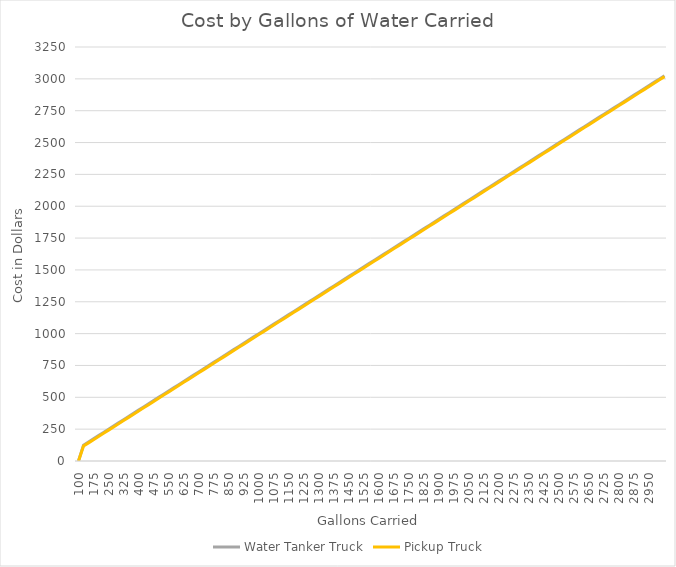
| Category | Water Tanker Truck | Pickup Truck |
|---|---|---|
| 100.0 | 0 | 0 |
| 125.0 | 124.402 | 117.357 |
| 150.0 | 149.402 | 142.357 |
| 175.0 | 174.402 | 167.357 |
| 200.0 | 199.402 | 192.357 |
| 225.0 | 224.402 | 217.357 |
| 250.0 | 249.402 | 242.357 |
| 275.0 | 274.402 | 267.357 |
| 300.0 | 299.402 | 292.357 |
| 325.0 | 324.402 | 317.357 |
| 350.0 | 349.402 | 342.357 |
| 375.0 | 374.402 | 367.357 |
| 400.0 | 399.402 | 392.357 |
| 425.0 | 424.402 | 417.357 |
| 450.0 | 449.402 | 442.357 |
| 475.0 | 474.402 | 467.357 |
| 500.0 | 499.402 | 492.357 |
| 525.0 | 524.402 | 517.357 |
| 550.0 | 549.402 | 542.357 |
| 575.0 | 574.402 | 567.357 |
| 600.0 | 599.402 | 592.357 |
| 625.0 | 624.402 | 617.357 |
| 650.0 | 649.402 | 642.357 |
| 675.0 | 674.402 | 667.357 |
| 700.0 | 699.402 | 692.357 |
| 725.0 | 724.402 | 717.357 |
| 750.0 | 749.402 | 742.357 |
| 775.0 | 774.402 | 767.357 |
| 800.0 | 799.402 | 792.357 |
| 825.0 | 824.402 | 817.357 |
| 850.0 | 849.402 | 842.357 |
| 875.0 | 874.402 | 867.357 |
| 900.0 | 899.402 | 892.357 |
| 925.0 | 924.402 | 917.357 |
| 950.0 | 949.402 | 942.357 |
| 975.0 | 974.402 | 967.357 |
| 1000.0 | 999.402 | 992.357 |
| 1025.0 | 1024.402 | 1017.357 |
| 1050.0 | 1049.402 | 1042.357 |
| 1075.0 | 1074.402 | 1067.357 |
| 1100.0 | 1099.402 | 1092.357 |
| 1125.0 | 1124.402 | 1117.357 |
| 1150.0 | 1149.402 | 1142.357 |
| 1175.0 | 1174.402 | 1167.357 |
| 1200.0 | 1199.402 | 1192.357 |
| 1225.0 | 1224.402 | 1217.357 |
| 1250.0 | 1249.402 | 1242.357 |
| 1275.0 | 1274.402 | 1267.357 |
| 1300.0 | 1299.402 | 1292.357 |
| 1325.0 | 1324.402 | 1317.357 |
| 1350.0 | 1349.402 | 1342.357 |
| 1375.0 | 1374.402 | 1367.357 |
| 1400.0 | 1399.402 | 1392.357 |
| 1425.0 | 1424.402 | 1417.357 |
| 1450.0 | 1449.402 | 1442.357 |
| 1475.0 | 1474.402 | 1467.357 |
| 1500.0 | 1499.402 | 1492.357 |
| 1525.0 | 1524.402 | 1517.357 |
| 1550.0 | 1549.402 | 1542.357 |
| 1575.0 | 1574.402 | 1567.357 |
| 1600.0 | 1599.402 | 1592.357 |
| 1625.0 | 1624.402 | 1617.357 |
| 1650.0 | 1649.402 | 1642.357 |
| 1675.0 | 1674.402 | 1667.357 |
| 1700.0 | 1699.402 | 1692.357 |
| 1725.0 | 1724.402 | 1717.357 |
| 1750.0 | 1749.402 | 1742.357 |
| 1775.0 | 1774.402 | 1767.357 |
| 1800.0 | 1799.402 | 1792.357 |
| 1825.0 | 1824.402 | 1817.357 |
| 1850.0 | 1849.402 | 1842.357 |
| 1875.0 | 1874.402 | 1867.357 |
| 1900.0 | 1899.402 | 1892.357 |
| 1925.0 | 1924.402 | 1917.357 |
| 1950.0 | 1949.402 | 1942.357 |
| 1975.0 | 1974.402 | 1967.357 |
| 2000.0 | 1999.402 | 1992.357 |
| 2025.0 | 2024.402 | 2017.357 |
| 2050.0 | 2049.402 | 2042.357 |
| 2075.0 | 2074.402 | 2067.357 |
| 2100.0 | 2099.402 | 2092.357 |
| 2125.0 | 2124.402 | 2117.357 |
| 2150.0 | 2149.402 | 2142.357 |
| 2175.0 | 2174.402 | 2167.357 |
| 2200.0 | 2199.402 | 2192.357 |
| 2225.0 | 2224.402 | 2217.357 |
| 2250.0 | 2249.402 | 2242.357 |
| 2275.0 | 2274.402 | 2267.357 |
| 2300.0 | 2299.402 | 2292.357 |
| 2325.0 | 2324.402 | 2317.357 |
| 2350.0 | 2349.402 | 2342.357 |
| 2375.0 | 2374.402 | 2367.357 |
| 2400.0 | 2399.402 | 2392.357 |
| 2425.0 | 2424.402 | 2417.357 |
| 2450.0 | 2449.402 | 2442.357 |
| 2475.0 | 2474.402 | 2467.357 |
| 2500.0 | 2499.402 | 2492.357 |
| 2525.0 | 2524.402 | 2517.357 |
| 2550.0 | 2549.402 | 2542.357 |
| 2575.0 | 2574.402 | 2567.357 |
| 2600.0 | 2599.402 | 2592.357 |
| 2625.0 | 2624.402 | 2617.357 |
| 2650.0 | 2649.402 | 2642.357 |
| 2675.0 | 2674.402 | 2667.357 |
| 2700.0 | 2699.402 | 2692.357 |
| 2725.0 | 2724.402 | 2717.357 |
| 2750.0 | 2749.402 | 2742.357 |
| 2775.0 | 2774.402 | 2767.357 |
| 2800.0 | 2799.402 | 2792.357 |
| 2825.0 | 2824.402 | 2817.357 |
| 2850.0 | 2849.402 | 2842.357 |
| 2875.0 | 2874.402 | 2867.357 |
| 2900.0 | 2899.402 | 2892.357 |
| 2925.0 | 2924.402 | 2917.357 |
| 2950.0 | 2949.402 | 2942.357 |
| 2975.0 | 2974.402 | 2967.357 |
| 3000.0 | 2999.402 | 2992.357 |